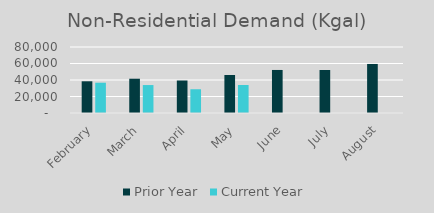
| Category | Prior Year | Current Year |
|---|---|---|
| February | 38439 | 36720 |
| March | 41545 | 33872 |
| April | 39390 | 28794 |
| May | 46068 | 33923 |
| June | 52164 | 0 |
| July | 52094 | 0 |
| August | 59449 | 0 |